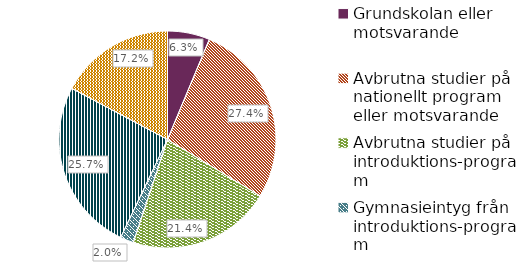
| Category | Series 0 |
|---|---|
| Grundskolan eller motsvarande | 0.063 |
| Avbrutna studier på nationellt program eller motsvarande  | 0.274 |
| Avbrutna studier på introduktions-program  | 0.214 |
| Gymnasieintyg från introduktions-program  | 0.02 |
| Studiebevis från nationellt program  | 0.257 |
| Uppgift saknas | 0.172 |